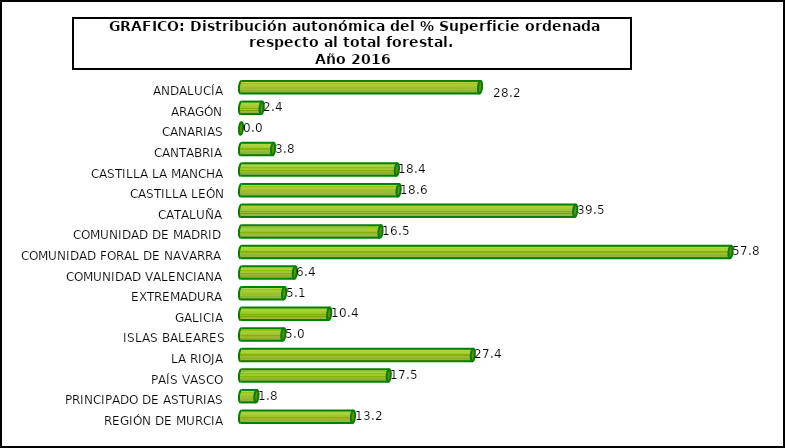
| Category | Series 1 |
|---|---|
| ANDALUCÍA | 28.248 |
| ARAGÓN | 2.439 |
| CANARIAS | 0 |
| CANTABRIA | 3.79 |
| CASTILLA LA MANCHA | 18.42 |
| CASTILLA LEÓN | 18.626 |
| CATALUÑA | 39.487 |
| COMUNIDAD DE MADRID | 16.49 |
| COMUNIDAD FORAL DE NAVARRA | 57.848 |
| COMUNIDAD VALENCIANA | 6.364 |
| EXTREMADURA | 5.093 |
| GALICIA | 10.417 |
| ISLAS BALEARES | 5.006 |
| LA RIOJA | 27.393 |
| PAÍS VASCO | 17.454 |
| PRINCIPADO DE ASTURIAS | 1.819 |
| REGIÓN DE MURCIA | 13.227 |